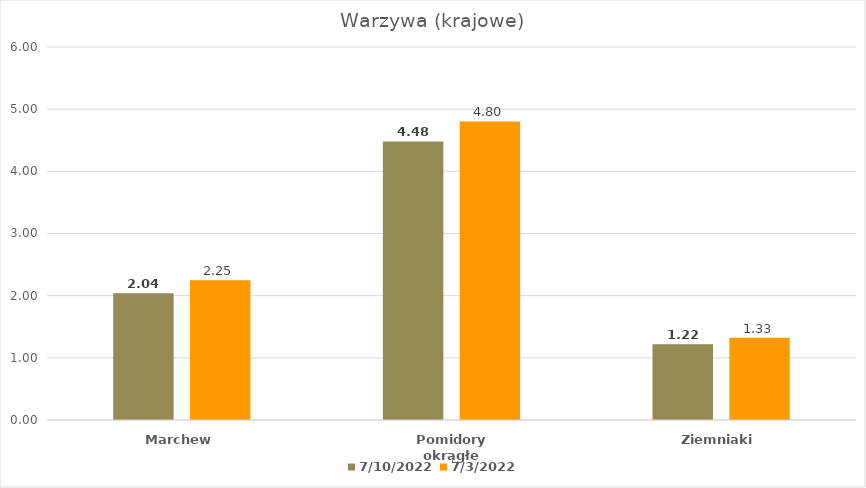
| Category | 10.07.2022 | 03.07.2022 |
|---|---|---|
| Marchew | 2.04 | 2.25 |
| Pomidory okrągłe | 4.48 | 4.803 |
| Ziemniaki | 1.22 | 1.325 |